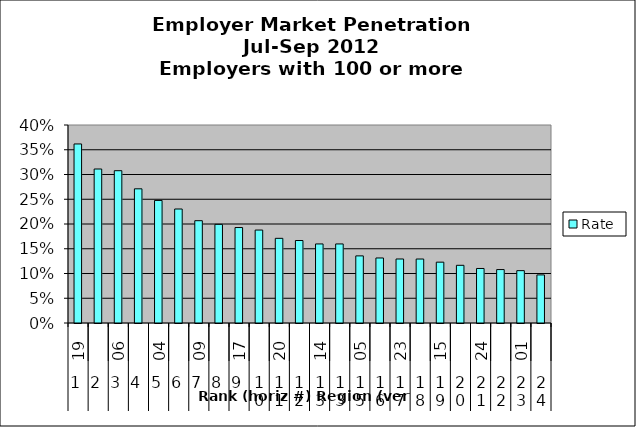
| Category | Rate |
|---|---|
| 0 | 0.362 |
| 1 | 0.311 |
| 2 | 0.308 |
| 3 | 0.271 |
| 4 | 0.248 |
| 5 | 0.23 |
| 6 | 0.207 |
| 7 | 0.199 |
| 8 | 0.193 |
| 9 | 0.188 |
| 10 | 0.171 |
| 11 | 0.167 |
| 12 | 0.16 |
| 13 | 0.16 |
| 14 | 0.136 |
| 15 | 0.131 |
| 16 | 0.129 |
| 17 | 0.129 |
| 18 | 0.123 |
| 19 | 0.117 |
| 20 | 0.11 |
| 21 | 0.108 |
| 22 | 0.106 |
| 23 | 0.097 |